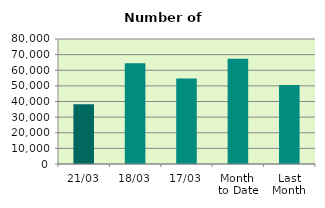
| Category | Series 0 |
|---|---|
| 21/03 | 38298 |
| 18/03 | 64414 |
| 17/03 | 54680 |
| Month 
to Date | 67338 |
| Last
Month | 50484.7 |